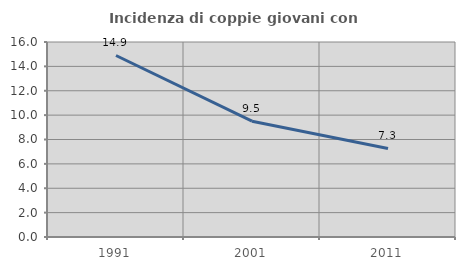
| Category | Incidenza di coppie giovani con figli |
|---|---|
| 1991.0 | 14.894 |
| 2001.0 | 9.5 |
| 2011.0 | 7.265 |